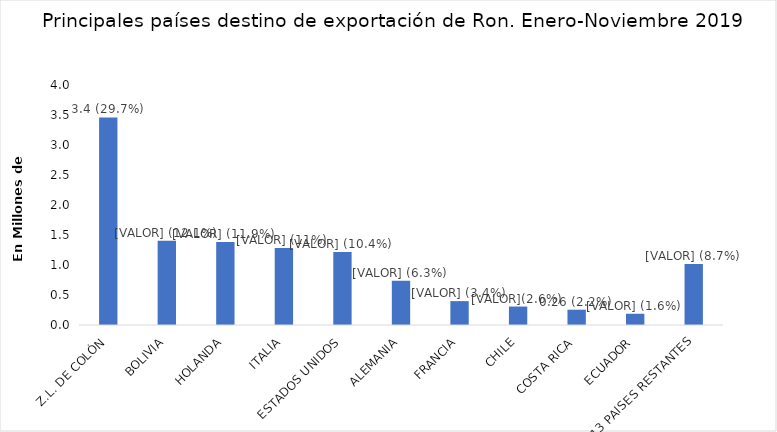
| Category | Series 0 |
|---|---|
| Z.L. DE COLÓN | 3460246 |
| BOLIVIA | 1403751 |
| HOLANDA | 1384595 |
| ITALIA | 1281399 |
| ESTADOS UNIDOS | 1216238 |
| ALEMANIA | 737422 |
| FRANCIA | 397924 |
| CHILE | 307732 |
| COSTA RICA | 255001 |
| ECUADOR | 187320 |
| 13 PAISES RESTANTES | 1015085 |